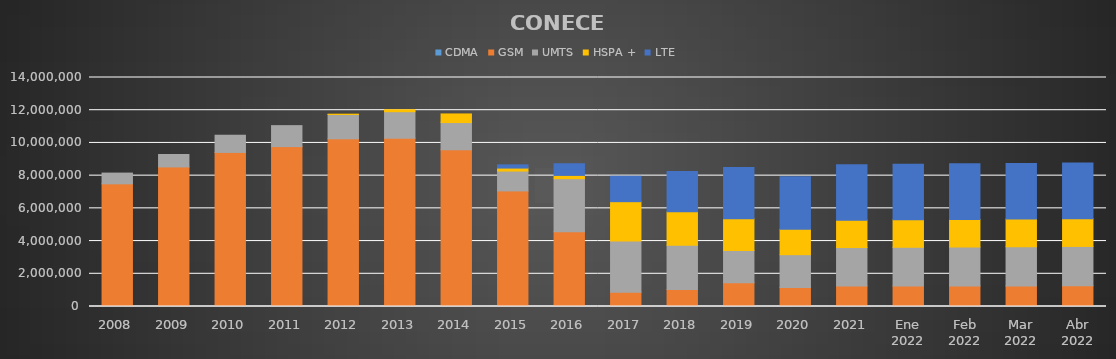
| Category | CDMA | GSM | UMTS | HSPA + | LTE |
|---|---|---|---|---|---|
| 2008 | 0 | 7499370 | 656989 | 0 | 0 |
| 2009 | 0 | 8532691 | 758577 | 0 | 0 |
| 2010 | 0 | 9419193 | 1051309 | 0 | 0 |
| 2011 | 0 | 9774865 | 1282451 | 0 | 0 |
| 2012 | 0 | 10252457 | 1484003 | 21446 | 0 |
| 2013 | 0 | 10287259 | 1622034 | 121593 | 0 |
| 2014 | 0 | 9581956 | 1664758 | 525306 | 0 |
| 2015 | 0 | 7065313 | 1214567 | 183109 | 195630 |
| 2016 | 0 | 4571999 | 3240700 | 201567 | 712557 |
| 2017 | 0 | 873346 | 3135577 | 2399460 | 1551880 |
| 2018 | 0 | 1039373 | 2706058 | 2049418 | 2453201 |
| 2019 | 0 | 1452334 | 1970422 | 1937931 | 3132367 |
| 2020 | 0 | 1158751 | 2009264 | 1548440 | 3212798 |
| 2021 | 0 | 1250925 | 2353798 | 1675346 | 3385646 |
| Ene 2022 | 0 | 1253803 | 2367204 | 1682872 | 3391452 |
| Feb 2022 | 0 | 1256245 | 2379435 | 1688963 | 3397299 |
| Mar 2022 | 0 | 1259631 | 2392596 | 1693034 | 3401696 |
| Abr 2022 | 0 | 1264438 | 2406911 | 1697322 | 3404685 |